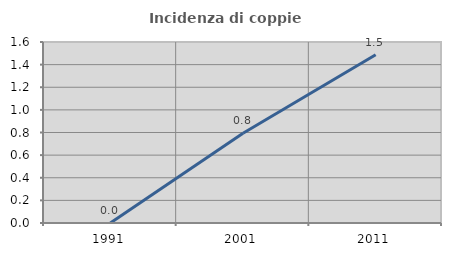
| Category | Incidenza di coppie miste |
|---|---|
| 1991.0 | 0 |
| 2001.0 | 0.794 |
| 2011.0 | 1.487 |